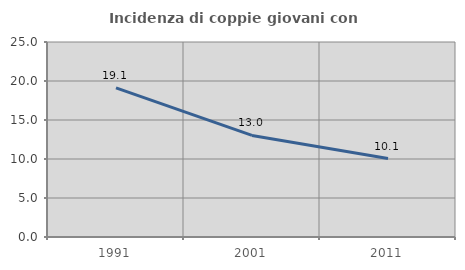
| Category | Incidenza di coppie giovani con figli |
|---|---|
| 1991.0 | 19.114 |
| 2001.0 | 13.022 |
| 2011.0 | 10.053 |